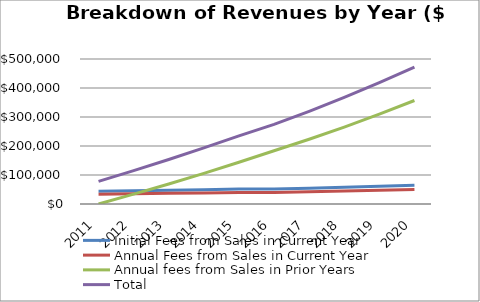
| Category | Initial Fees from Sales in Current Year | Annual Fees from Sales in Current Year | Annual fees from Sales in Prior Years | Total |
|---|---|---|---|---|
| 2011.0 | 44000 | 33875 | 0 | 77875 |
| 2012.0 | 45760 | 35230 | 33875 | 114865 |
| 2013.0 | 47590.4 | 36639.2 | 69105 | 153334.6 |
| 2014.0 | 49494.016 | 38104.768 | 105744.2 | 193342.984 |
| 2015.0 | 51473.777 | 39628.959 | 143848.968 | 234951.703 |
| 2016.0 | 51473.777 | 39628.959 | 183477.927 | 274580.662 |
| 2017.0 | 54562.203 | 42006.696 | 223106.885 | 319675.785 |
| 2018.0 | 57835.935 | 44527.098 | 265113.582 | 367476.615 |
| 2019.0 | 61306.092 | 47198.724 | 309640.68 | 418145.495 |
| 2020.0 | 64984.457 | 50030.647 | 356839.404 | 471854.508 |